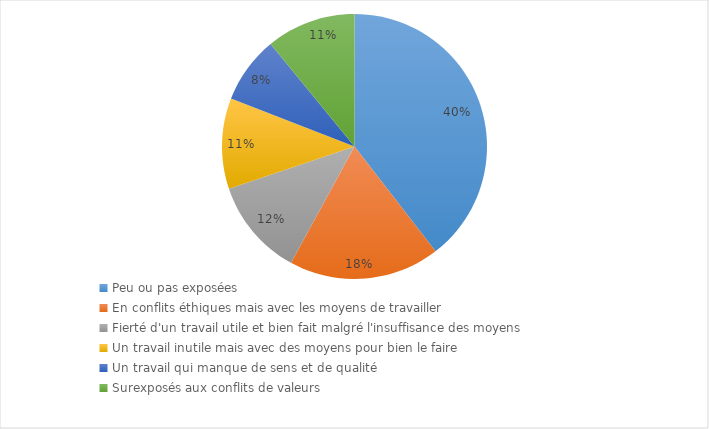
| Category | Series 0 |
|---|---|
| Peu ou pas exposées | 39.53 |
| En conflits éthiques mais avec les moyens de travailler | 18.42 |
| Fierté d'un travail utile et bien fait malgré l'insuffisance des moyens | 11.89 |
| Un travail inutile mais avec des moyens pour bien le faire | 11.06 |
| Un travail qui manque de sens et de qualité | 8.19 |
| Surexposés aux conflits de valeurs | 10.91 |